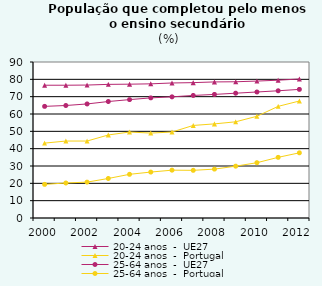
| Category | 20-24 anos  -  UE27 | 20-24 anos  -  Portugal | 25-64 anos  -  UE27 | 25-64 anos  -  Portugal |
|---|---|---|---|---|
| 2000.0 | 76.6 | 43.2 | 64.4 | 19.4 |
| 2001.0 | 76.6 | 44.4 | 64.9 | 20.2 |
| 2002.0 | 76.7 | 44.4 | 65.8 | 20.7 |
| 2003.0 | 77.1 | 47.9 | 67.2 | 22.8 |
| 2004.0 | 77.2 | 49.6 | 68.3 | 25.2 |
| 2005.0 | 77.4 | 49 | 69.3 | 26.5 |
| 2006.0 | 77.9 | 49.6 | 69.9 | 27.6 |
| 2007.0 | 78.1 | 53.4 | 70.7 | 27.5 |
| 2008.0 | 78.5 | 54.3 | 71.3 | 28.2 |
| 2009.0 | 78.6 | 55.5 | 72 | 29.9 |
| 2010.0 | 79 | 58.7 | 72.7 | 31.9 |
| 2011.0 | 79.5 | 64.4 | 73.4 | 35 |
| 2012.0 | 80.2 | 67.5 | 74.2 | 37.6 |